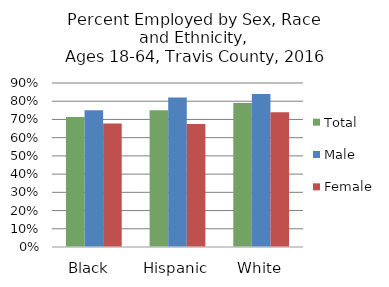
| Category | Total  | Male  | Female |
|---|---|---|---|
| Black  | 0.714 | 0.751 | 0.678 |
| Hispanic | 0.75 | 0.821 | 0.675 |
| White | 0.791 | 0.839 | 0.74 |